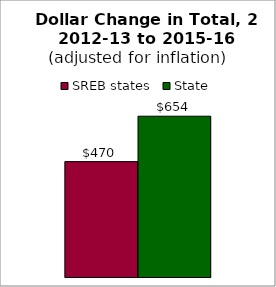
| Category | SREB states | State |
|---|---|---|
| 0 | 469.608 | 654.357 |